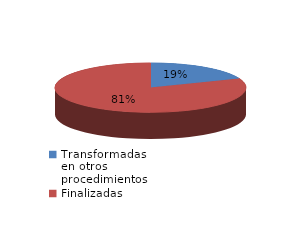
| Category | Series 0 |
|---|---|
| Transformadas en otros procedimientos | 12744 |
| Finalizadas | 54707 |